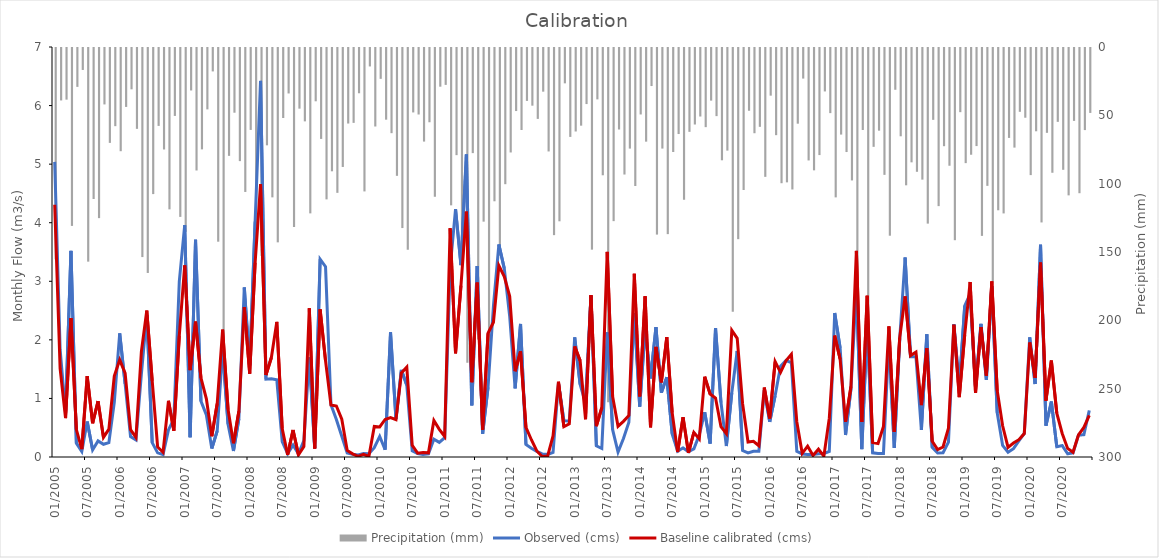
| Category | Precipitation (mm) |
|---|---|
| 2005-01-01 | 154.63 |
| 2005-02-01 | 38.38 |
| 2005-03-01 | 37.78 |
| 2005-04-01 | 130.17 |
| 2005-05-01 | 28.45 |
| 2005-06-01 | 16.07 |
| 2005-07-01 | 156.33 |
| 2005-08-01 | 110.5 |
| 2005-09-01 | 124.49 |
| 2005-10-01 | 41.29 |
| 2005-11-01 | 69.43 |
| 2005-12-01 | 57.19 |
| 2006-01-01 | 75.52 |
| 2006-02-01 | 43.12 |
| 2006-03-01 | 30.23 |
| 2006-04-01 | 59.16 |
| 2006-05-01 | 152.98 |
| 2006-06-01 | 164.61 |
| 2006-07-01 | 106.9 |
| 2006-08-01 | 57.01 |
| 2006-09-01 | 74.26 |
| 2006-10-01 | 118.06 |
| 2006-11-01 | 49.7 |
| 2006-12-01 | 123.58 |
| 2007-01-01 | 134.5 |
| 2007-02-01 | 31.07 |
| 2007-03-01 | 89.62 |
| 2007-04-01 | 74.18 |
| 2007-05-01 | 44.92 |
| 2007-06-01 | 17.14 |
| 2007-07-01 | 141.73 |
| 2007-08-01 | 238.04 |
| 2007-09-01 | 78.92 |
| 2007-10-01 | 47.35 |
| 2007-11-01 | 82.77 |
| 2007-12-01 | 105.33 |
| 2008-01-01 | 59.94 |
| 2008-02-01 | 130.27 |
| 2008-03-01 | 152.09 |
| 2008-04-01 | 71.22 |
| 2008-05-01 | 109.29 |
| 2008-06-01 | 142.21 |
| 2008-07-01 | 51.24 |
| 2008-08-01 | 33.27 |
| 2008-09-01 | 130.96 |
| 2008-10-01 | 44.38 |
| 2008-11-01 | 53.69 |
| 2008-12-01 | 121.01 |
| 2009-01-01 | 39 |
| 2009-02-01 | 66.53 |
| 2009-03-01 | 110.76 |
| 2009-04-01 | 90.22 |
| 2009-05-01 | 105.98 |
| 2009-06-01 | 87.05 |
| 2009-07-01 | 55.27 |
| 2009-08-01 | 54.79 |
| 2009-09-01 | 33.12 |
| 2009-10-01 | 104.94 |
| 2009-11-01 | 13.5 |
| 2009-12-01 | 57.44 |
| 2010-01-01 | 22.57 |
| 2010-02-01 | 52.45 |
| 2010-03-01 | 62.32 |
| 2010-04-01 | 93.54 |
| 2010-05-01 | 131.75 |
| 2010-06-01 | 147.62 |
| 2010-07-01 | 47.15 |
| 2010-08-01 | 48.66 |
| 2010-09-01 | 68.48 |
| 2010-10-01 | 54.33 |
| 2010-11-01 | 108.85 |
| 2010-12-01 | 28.31 |
| 2011-01-01 | 26.99 |
| 2011-02-01 | 115.13 |
| 2011-03-01 | 78.4 |
| 2011-04-01 | 145.47 |
| 2011-05-01 | 230.35 |
| 2011-06-01 | 76.92 |
| 2011-07-01 | 213.3 |
| 2011-08-01 | 127.06 |
| 2011-09-01 | 220.04 |
| 2011-10-01 | 112.16 |
| 2011-11-01 | 151.9 |
| 2011-12-01 | 99.65 |
| 2012-01-01 | 76.44 |
| 2012-02-01 | 46.14 |
| 2012-03-01 | 60.02 |
| 2012-04-01 | 38.71 |
| 2012-05-01 | 42.2 |
| 2012-06-01 | 51.88 |
| 2012-07-01 | 31.96 |
| 2012-08-01 | 75.7 |
| 2012-09-01 | 136.93 |
| 2012-10-01 | 126.8 |
| 2012-11-01 | 25.86 |
| 2012-12-01 | 65.06 |
| 2013-01-01 | 61.09 |
| 2013-02-01 | 56.83 |
| 2013-03-01 | 41.02 |
| 2013-04-01 | 147.55 |
| 2013-05-01 | 37.6 |
| 2013-06-01 | 93.13 |
| 2013-07-01 | 259.16 |
| 2013-08-01 | 126.68 |
| 2013-09-01 | 59.64 |
| 2013-10-01 | 92.58 |
| 2013-11-01 | 73.61 |
| 2013-12-01 | 100.97 |
| 2014-01-01 | 48.63 |
| 2014-02-01 | 68.53 |
| 2014-03-01 | 27.84 |
| 2014-04-01 | 136.53 |
| 2014-05-01 | 73.59 |
| 2014-06-01 | 136.19 |
| 2014-07-01 | 76.11 |
| 2014-08-01 | 62.95 |
| 2014-09-01 | 111.04 |
| 2014-10-01 | 61.34 |
| 2014-11-01 | 55.98 |
| 2014-12-01 | 50.14 |
| 2015-01-01 | 57.91 |
| 2015-02-01 | 38.5 |
| 2015-03-01 | 49.84 |
| 2015-04-01 | 82.16 |
| 2015-05-01 | 75.08 |
| 2015-06-01 | 193.05 |
| 2015-07-01 | 139.88 |
| 2015-08-01 | 103.9 |
| 2015-09-01 | 45.92 |
| 2015-10-01 | 62.36 |
| 2015-11-01 | 57.68 |
| 2015-12-01 | 94.28 |
| 2016-01-01 | 34.87 |
| 2016-02-01 | 63.78 |
| 2016-03-01 | 98.94 |
| 2016-04-01 | 98.31 |
| 2016-05-01 | 103.52 |
| 2016-06-01 | 55.38 |
| 2016-07-01 | 22.38 |
| 2016-08-01 | 82.28 |
| 2016-09-01 | 89.52 |
| 2016-10-01 | 78.35 |
| 2016-11-01 | 31.79 |
| 2016-12-01 | 47.65 |
| 2017-01-01 | 109.3 |
| 2017-02-01 | 63.35 |
| 2017-03-01 | 76.13 |
| 2017-04-01 | 96.9 |
| 2017-05-01 | 169.33 |
| 2017-06-01 | 59.99 |
| 2017-07-01 | 225.91 |
| 2017-08-01 | 72.32 |
| 2017-09-01 | 60.49 |
| 2017-10-01 | 92.82 |
| 2017-11-01 | 137.35 |
| 2017-12-01 | 30.56 |
| 2018-01-01 | 64.6 |
| 2018-02-01 | 100.47 |
| 2018-03-01 | 83.67 |
| 2018-04-01 | 90.58 |
| 2018-05-01 | 96.32 |
| 2018-06-01 | 128.5 |
| 2018-07-01 | 52.58 |
| 2018-08-01 | 115.7 |
| 2018-09-01 | 71.85 |
| 2018-10-01 | 86.15 |
| 2018-11-01 | 140.63 |
| 2018-12-01 | 46.95 |
| 2019-01-01 | 84.24 |
| 2019-02-01 | 78.1 |
| 2019-03-01 | 71.76 |
| 2019-04-01 | 137.47 |
| 2019-05-01 | 100.87 |
| 2019-06-01 | 171.37 |
| 2019-07-01 | 118.74 |
| 2019-08-01 | 121.04 |
| 2019-09-01 | 65.8 |
| 2019-10-01 | 72.88 |
| 2019-11-01 | 46.69 |
| 2019-12-01 | 51.02 |
| 2020-01-01 | 93 |
| 2020-02-01 | 60.94 |
| 2020-03-01 | 127.64 |
| 2020-04-01 | 62.08 |
| 2020-05-01 | 91.29 |
| 2020-06-01 | 54.04 |
| 2020-07-01 | 89.13 |
| 2020-08-01 | 107.83 |
| 2020-09-01 | 53.33 |
| 2020-10-01 | 106.25 |
| 2020-11-01 | 60.06 |
| 2020-12-01 | 47.51 |